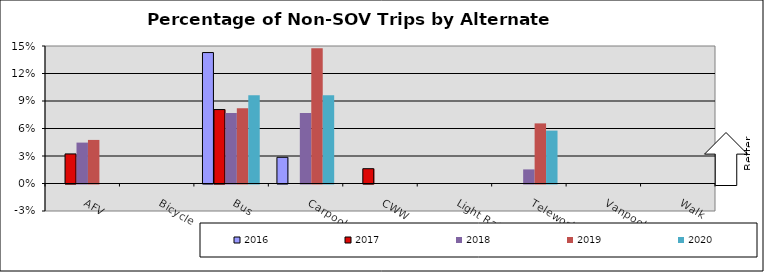
| Category | 2016 | 2017 | 2018 | 2019 | 2020 |
|---|---|---|---|---|---|
| AFV | 0 | 0.032 | 0.045 | 0.048 | 0 |
| Bicycle | 0 | 0 | 0 | 0 | 0 |
| Bus | 0.143 | 0.081 | 0.077 | 0.082 | 0.096 |
| Carpool | 0.029 | 0 | 0.077 | 0.148 | 0.096 |
| CWW | 0 | 0.016 | 0 | 0 | 0 |
| Light Rail | 0 | 0 | 0 | 0 | 0 |
| Telework | 0 | 0 | 0.015 | 0.066 | 0.058 |
| Vanpool | 0 | 0 | 0 | 0 | 0 |
| Walk | 0 | 0 | 0 | 0 | 0 |